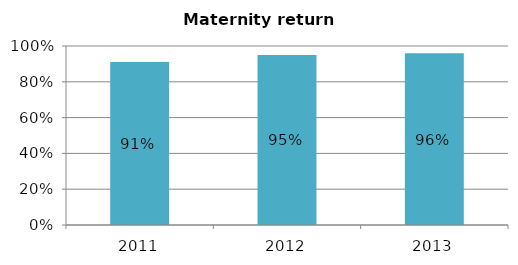
| Category | % return |
|---|---|
| 2011.0 | 0.91 |
| 2012.0 | 0.95 |
| 2013.0 | 0.96 |